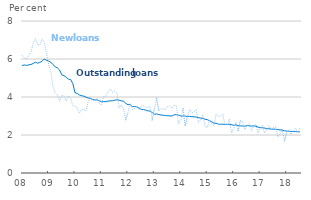
| Category | Outstanding loans | New loans |
|---|---|---|
| 2008-01-01 | 5.649 | 6.188 |
| 2008-02-01 | 5.689 | 6.066 |
| 2008-03-01 | 5.66 | 6.019 |
| 2008-04-01 | 5.691 | 6.182 |
| 2008-05-01 | 5.712 | 6.356 |
| 2008-06-01 | 5.762 | 6.808 |
| 2008-07-01 | 5.832 | 7.092 |
| 2008-08-01 | 5.78 | 6.751 |
| 2008-09-01 | 5.817 | 6.708 |
| 2008-10-01 | 5.879 | 7.069 |
| 2008-11-01 | 5.998 | 6.883 |
| 2008-12-01 | 5.936 | 6.356 |
| 2009-01-01 | 5.889 | 5.748 |
| 2009-02-01 | 5.839 | 5.342 |
| 2009-03-01 | 5.705 | 4.535 |
| 2009-04-01 | 5.594 | 4.232 |
| 2009-05-01 | 5.532 | 4.113 |
| 2009-06-01 | 5.42 | 3.775 |
| 2009-07-01 | 5.166 | 4.074 |
| 2009-08-01 | 5.128 | 4.052 |
| 2009-09-01 | 5.037 | 3.794 |
| 2009-10-01 | 4.941 | 4.062 |
| 2009-11-01 | 4.92 | 3.93 |
| 2009-12-01 | 4.707 | 3.556 |
| 2010-01-01 | 4.223 | 3.515 |
| 2010-02-01 | 4.187 | 3.435 |
| 2010-03-01 | 4.105 | 3.14 |
| 2010-04-01 | 4.068 | 3.362 |
| 2010-05-01 | 4.045 | 3.338 |
| 2010-06-01 | 3.987 | 3.297 |
| 2010-07-01 | 3.947 | 3.767 |
| 2010-08-01 | 3.929 | 3.902 |
| 2010-09-01 | 3.865 | 3.812 |
| 2010-10-01 | 3.846 | 3.836 |
| 2010-11-01 | 3.849 | 3.904 |
| 2010-12-01 | 3.802 | 3.654 |
| 2011-01-01 | 3.751 | 3.6 |
| 2011-02-01 | 3.754 | 4.016 |
| 2011-03-01 | 3.758 | 4.051 |
| 2011-04-01 | 3.786 | 4.279 |
| 2011-05-01 | 3.798 | 4.408 |
| 2011-06-01 | 3.8 | 4.258 |
| 2011-07-01 | 3.832 | 4.315 |
| 2011-08-01 | 3.852 | 4.201 |
| 2011-09-01 | 3.833 | 3.412 |
| 2011-10-01 | 3.795 | 3.597 |
| 2011-11-01 | 3.781 | 3.367 |
| 2011-12-01 | 3.666 | 2.8 |
| 2012-01-01 | 3.593 | 3.166 |
| 2012-02-01 | 3.608 | 3.674 |
| 2012-03-01 | 3.497 | 3.352 |
| 2012-04-01 | 3.498 | 3.395 |
| 2012-05-01 | 3.484 | 3.535 |
| 2012-06-01 | 3.423 | 3.344 |
| 2012-07-01 | 3.348 | 3.528 |
| 2012-08-01 | 3.341 | 3.545 |
| 2012-09-01 | 3.314 | 3.463 |
| 2012-10-01 | 3.27 | 3.467 |
| 2012-11-01 | 3.264 | 3.512 |
| 2012-12-01 | 3.182 | 2.791 |
| 2013-01-01 | 3.091 | 3.361 |
| 2013-02-01 | 3.11 | 3.938 |
| 2013-03-01 | 3.076 | 3.268 |
| 2013-04-01 | 3.051 | 3.373 |
| 2013-05-01 | 3.043 | 3.361 |
| 2013-06-01 | 3.025 | 3.352 |
| 2013-07-01 | 3.015 | 3.498 |
| 2013-08-01 | 3.008 | 3.519 |
| 2013-09-01 | 2.997 | 3.409 |
| 2013-10-01 | 3.066 | 3.586 |
| 2013-11-01 | 3.07 | 3.503 |
| 2013-12-01 | 3.047 | 2.583 |
| 2014-01-01 | 3.004 | 2.81 |
| 2014-02-01 | 2.999 | 3.401 |
| 2014-03-01 | 2.991 | 2.489 |
| 2014-04-01 | 2.981 | 2.986 |
| 2014-05-01 | 2.98 | 3.354 |
| 2014-06-01 | 2.965 | 3.167 |
| 2014-07-01 | 2.956 | 3.219 |
| 2014-08-01 | 2.944 | 3.345 |
| 2014-09-01 | 2.915 | 2.658 |
| 2014-10-01 | 2.892 | 2.773 |
| 2014-11-01 | 2.88 | 3.056 |
| 2014-12-01 | 2.828 | 2.429 |
| 2015-01-01 | 2.808 | 2.395 |
| 2015-02-01 | 2.751 | 2.81 |
| 2015-03-01 | 2.695 | 2.568 |
| 2015-04-01 | 2.621 | 2.51 |
| 2015-05-01 | 2.62 | 3.095 |
| 2015-06-01 | 2.572 | 2.964 |
| 2015-07-01 | 2.567 | 3.015 |
| 2015-08-01 | 2.566 | 3.113 |
| 2015-09-01 | 2.561 | 2.539 |
| 2015-10-01 | 2.56 | 2.551 |
| 2015-11-01 | 2.563 | 2.832 |
| 2015-12-01 | 2.538 | 2.101 |
| 2016-01-01 | 2.512 | 2.345 |
| 2016-02-01 | 2.529 | 2.673 |
| 2016-03-01 | 2.496 | 2.221 |
| 2016-04-01 | 2.481 | 2.75 |
| 2016-05-01 | 2.476 | 2.702 |
| 2016-06-01 | 2.459 | 2.282 |
| 2016-07-01 | 2.496 | 2.472 |
| 2016-08-01 | 2.486 | 2.602 |
| 2016-09-01 | 2.466 | 2.214 |
| 2016-10-01 | 2.479 | 2.433 |
| 2016-11-01 | 2.468 | 2.584 |
| 2016-12-01 | 2.414 | 2.095 |
| 2017-01-01 | 2.389 | 2.407 |
| 2017-02-01 | 2.38 | 2.521 |
| 2017-03-01 | 2.366 | 2.111 |
| 2017-04-01 | 2.333 | 2.273 |
| 2017-05-01 | 2.328 | 2.496 |
| 2017-06-01 | 2.309 | 2.266 |
| 2017-07-01 | 2.307 | 2.395 |
| 2017-08-01 | 2.305 | 2.465 |
| 2017-09-01 | 2.286 | 1.894 |
| 2017-10-01 | 2.269 | 2.058 |
| 2017-11-01 | 2.261 | 2.284 |
| 2017-12-01 | 2.223 | 1.692 |
| 2018-01-01 | 2.205 | 2.129 |
| 2018-02-01 | 2.201 | 2.271 |
| 2018-03-01 | 2.189 | 2.036 |
| 2018-04-01 | 2.182 | 2.203 |
| 2018-05-01 | 2.179 | 2.366 |
| 2018-06-01 | 2.169 | 2.137 |
| 2018-07-01 | 2.167 | 2.352 |